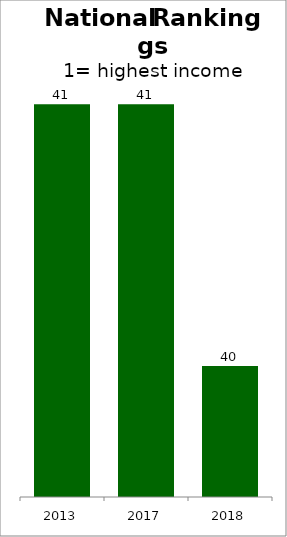
| Category | Series 0 |
|---|---|
| 2013.0 | 41 |
| 2017.0 | 41 |
| 2018.0 | 40 |